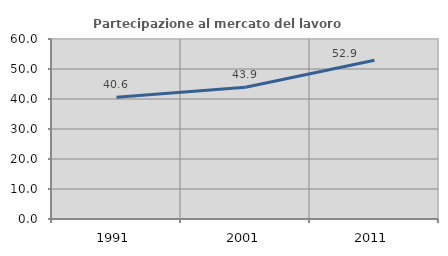
| Category | Partecipazione al mercato del lavoro  femminile |
|---|---|
| 1991.0 | 40.553 |
| 2001.0 | 43.925 |
| 2011.0 | 52.933 |